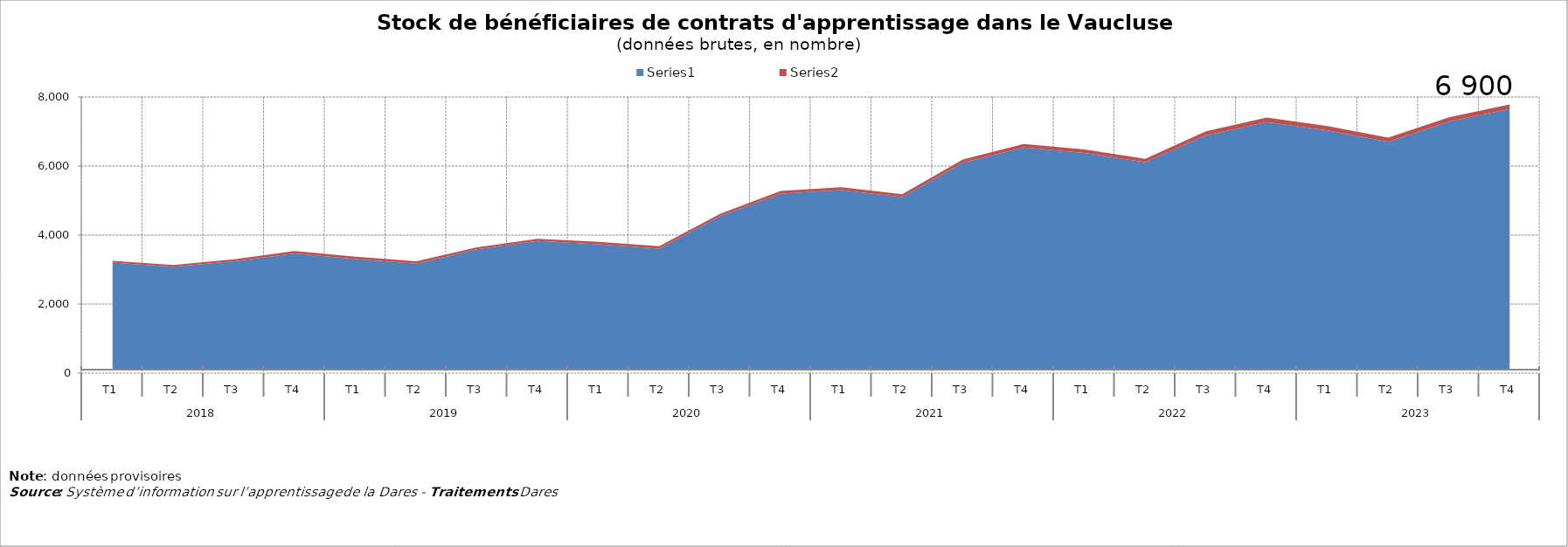
| Category | Series 0 | Series 1 |
|---|---|---|
| 0 | 3202 | 52 |
| 1 | 3080 | 51 |
| 2 | 3240 | 59 |
| 3 | 3466 | 71 |
| 4 | 3301 | 71 |
| 5 | 3171 | 70 |
| 6 | 3588 | 58 |
| 7 | 3828 | 67 |
| 8 | 3732 | 69 |
| 9 | 3607 | 69 |
| 10 | 4549 | 66 |
| 11 | 5200 | 79 |
| 12 | 5303 | 81 |
| 13 | 5104 | 79 |
| 14 | 6103 | 87 |
| 15 | 6540 | 99 |
| 16 | 6382 | 99 |
| 17 | 6112 | 99 |
| 18 | 6893 | 112 |
| 19 | 7272 | 132 |
| 20 | 7033 | 126 |
| 21 | 6700 | 123 |
| 22 | 7288 | 123 |
| 23 | 7651 | 135 |